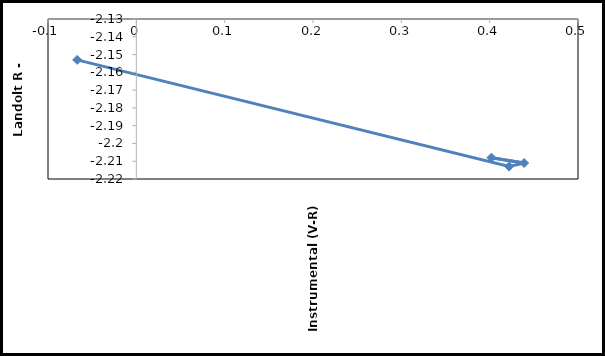
| Category | Series 0 |
|---|---|
| -0.0670000000000002 | -2.153 |
| 0.422000000000001 | -2.213 |
| 0.439 | -2.211 |
| 0.401999999999998 | -2.208 |